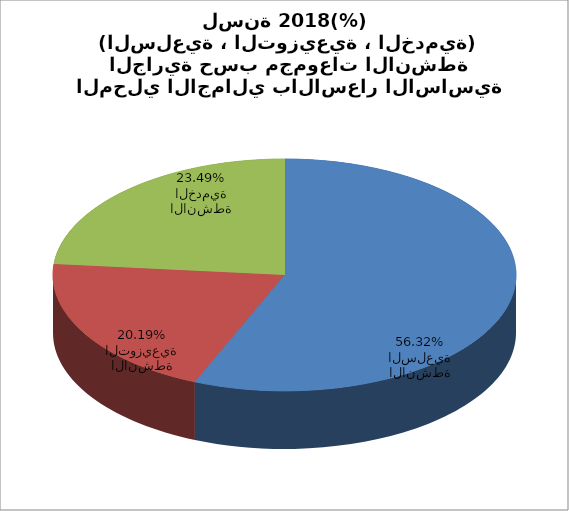
| Category | Series 0 |
|---|---|
| الانشطة السلعية | 56.323 |
| الانشطة التوزيعية | 20.192 |
| الانشطة الخدمية | 23.485 |